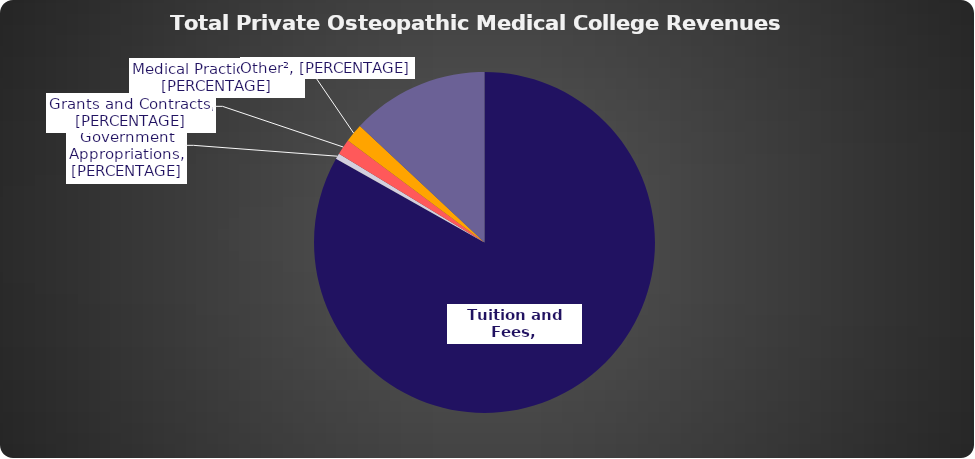
| Category | Series 0 |
|---|---|
| 0 | 1335531153.21 |
| 1 | 8859153.23 |
| 2 | 23777406.5 |
| 3 | 28238805 |
| 4 | 209393806.83 |